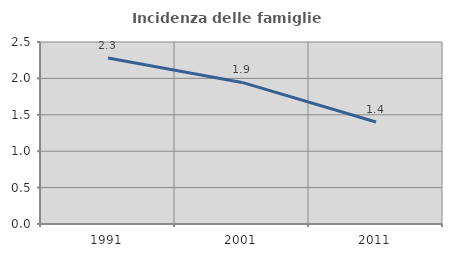
| Category | Incidenza delle famiglie numerose |
|---|---|
| 1991.0 | 2.28 |
| 2001.0 | 1.945 |
| 2011.0 | 1.401 |